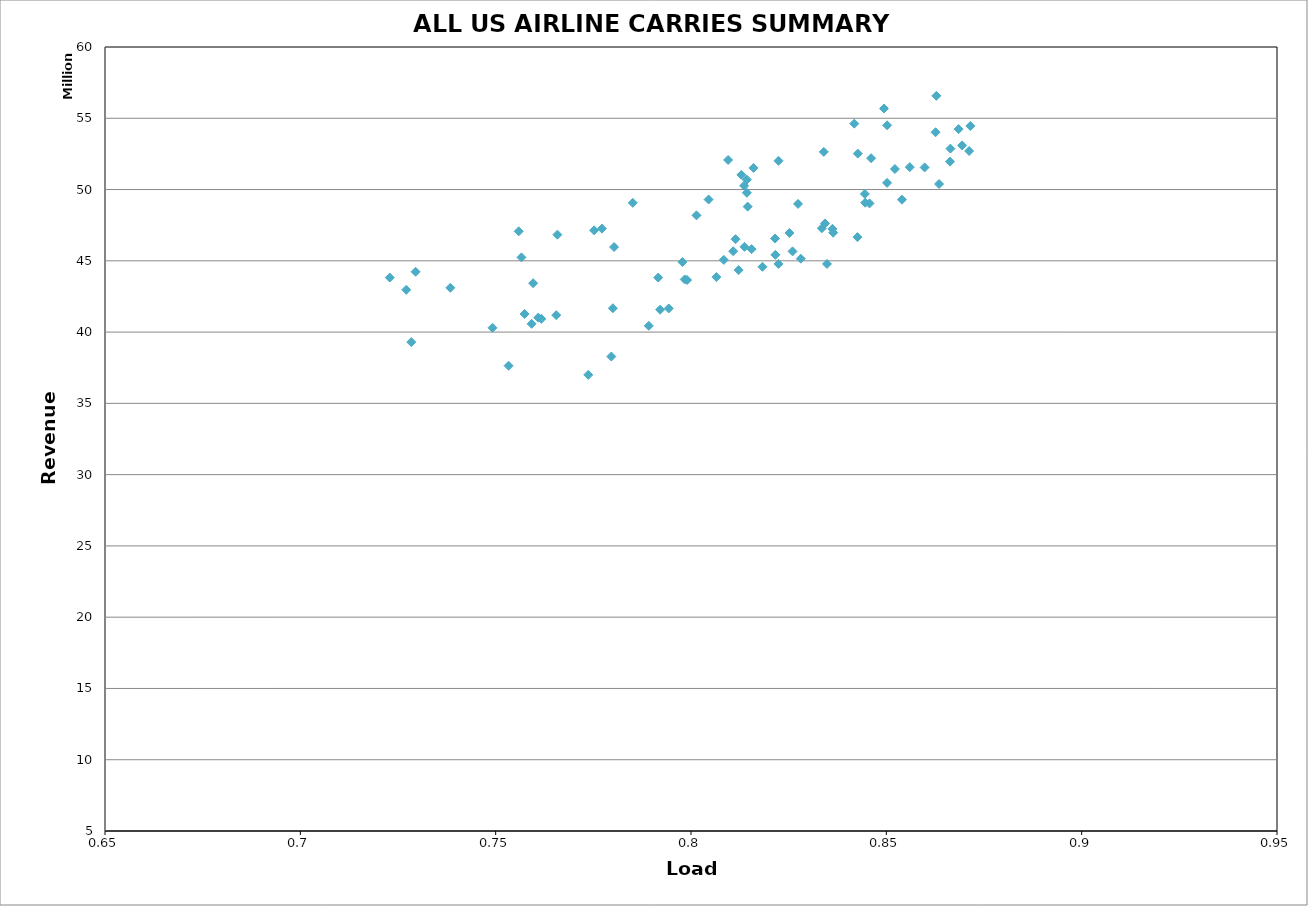
| Category | Series 0 |
|---|---|
| 72.71 | 42966268 |
| 76.17 | 40927215 |
| 81.43 | 50693391 |
| 81.45 | 48800883 |
| 80.45 | 49302219 |
| 84.61 | 52200272 |
| 85.02 | 54506446 |
| 80.95 | 52074386 |
| 73.84 | 43108587 |
| 77.52 | 47137132 |
| 78.03 | 45966808 |
| 76.58 | 46835639 |
| 72.29 | 43823680 |
| 75.74 | 41270274 |
| 81.6 | 51518429 |
| 81.43 | 49772604 |
| 81.29 | 51031835 |
| 86.26 | 54018698 |
| 86.28 | 56572990 |
| 84.94 | 55682567 |
| 75.66 | 45240419 |
| 78.51 | 49069269 |
| 77.72 | 47256388 |
| 75.59 | 47070645 |
| 72.95 | 44233383 |
| 75.96 | 43429251 |
| 82.24 | 52016986 |
| 80.14 | 48189445 |
| 81.36 | 50259912 |
| 84.27 | 52521309 |
| 84.18 | 54621353 |
| 83.4 | 52643145 |
| 76.09 | 41015589 |
| 79.78 | 44913078 |
| 75.92 | 40578576 |
| 79.16 | 43824845 |
| 72.84 | 39299677 |
| 75.33 | 37640543 |
| 81.14 | 46517762 |
| 82.16 | 45419272 |
| 81.37 | 45980480 |
| 85.4 | 49290277 |
| 87.12 | 52704797 |
| 85.02 | 50467288 |
| 79.43 | 41656736 |
| 82.24 | 44781574 |
| 79.21 | 41573015 |
| 79.9 | 43650676 |
| 74.92 | 40301481 |
| 77.37 | 36997641 |
| 83.43 | 47619591 |
| 82.6 | 45662025 |
| 82.52 | 46953589 |
| 86.35 | 50387611 |
| 86.94 | 53095873 |
| 85.22 | 51439492 |
| 79.84 | 43694603 |
| 83.35 | 47283497 |
| 81.22 | 44351331 |
| 80.84 | 45067192 |
| 76.55 | 41187426 |
| 77.96 | 38285134 |
| 82.74 | 48992221 |
| 82.15 | 46567364 |
| 84.57 | 49026667 |
| 85.98 | 51552204 |
| 87.15 | 54459007 |
| 85.6 | 51570688 |
| 81.83 | 44580290 |
| 83.64 | 46972407 |
| 83.48 | 44780150 |
| 81.08 | 45673434 |
| 78.0 | 41673200 |
| 78.92 | 40440608 |
| 84.45 | 49693743 |
| 83.62 | 47240808 |
| 84.46 | 49075103 |
| 86.63 | 51958863 |
| 86.85 | 54239648 |
| 86.64 | 52870434 |
| 80.65 | 43861215 |
| 84.26 | 46661129 |
| 82.81 | 45148868 |
| 81.55 | 45818778 |